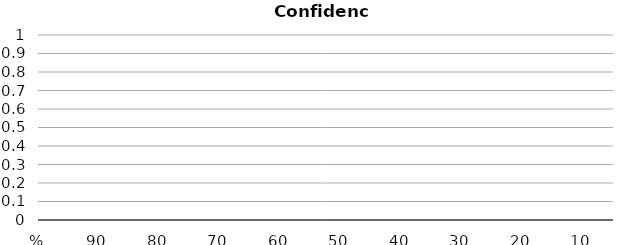
| Category | CFU/m3 |
|---|---|
| % | 0 |
| 95 | 0 |
| 90 | 0 |
| 85 | 0 |
| 80 | 0 |
| 75 | 0 |
| 70 | 0 |
| 65 | 0 |
| 60 | 0 |
| 55 | 0 |
| 50 | 0 |
| 45 | 0 |
| 40 | 0 |
| 35 | 0 |
| 30 | 0 |
| 25 | 0 |
| 20 | 0 |
| 15 | 0 |
| 10 | 0 |
| 5 | 0 |